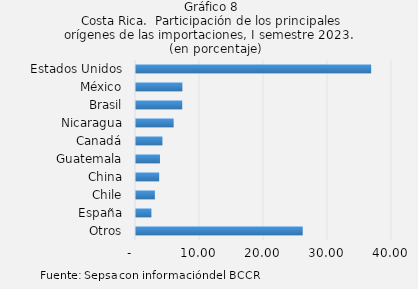
| Category | Series 0 |
|---|---|
| Otros | 26.051 |
| España | 2.407 |
| Chile | 2.952 |
| China | 3.621 |
| Guatemala | 3.744 |
| Canadá | 4.13 |
| Nicaragua | 5.881 |
| Brasil | 7.224 |
| México | 7.246 |
| Estados Unidos | 36.745 |